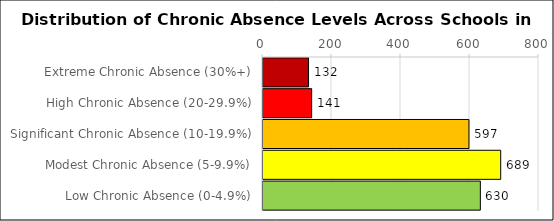
| Category | Number of Schools |
|---|---|
| Extreme Chronic Absence (30%+) | 132 |
| High Chronic Absence (20-29.9%) | 141 |
| Significant Chronic Absence (10-19.9%) | 597 |
| Modest Chronic Absence (5-9.9%) | 689 |
| Low Chronic Absence (0-4.9%) | 630 |